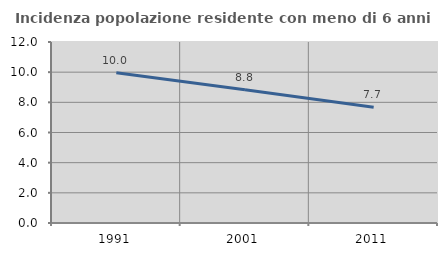
| Category | Incidenza popolazione residente con meno di 6 anni |
|---|---|
| 1991.0 | 9.963 |
| 2001.0 | 8.829 |
| 2011.0 | 7.679 |